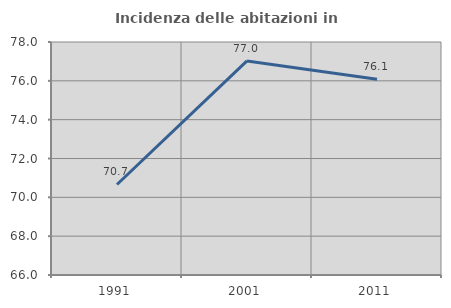
| Category | Incidenza delle abitazioni in proprietà  |
|---|---|
| 1991.0 | 70.661 |
| 2001.0 | 77.025 |
| 2011.0 | 76.082 |